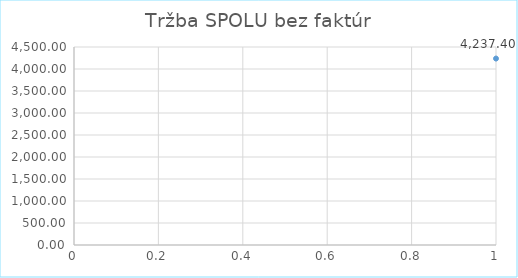
| Category | Series 0 |
|---|---|
| 0 | 4237.4 |
| 1 | 0 |
| 2 | 0 |
| 3 | 0 |
| 4 | 0 |
| 5 | 0 |
| 6 | 0 |
| 7 | 0 |
| 8 | 0 |
| 9 | 0 |
| 10 | 0 |
| 11 | 0 |